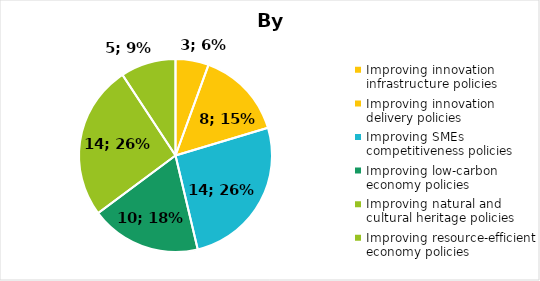
| Category | Total |
|---|---|
| Improving innovation infrastructure policies | 3 |
| Improving innovation delivery policies | 8 |
| Improving SMEs competitiveness policies | 14 |
| Improving low-carbon economy policies | 10 |
| Improving natural and cultural heritage policies | 14 |
| Improving resource-efficient economy policies | 5 |